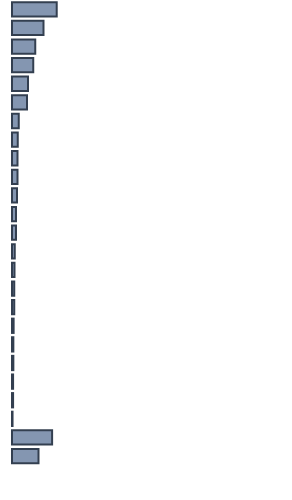
| Category | Series 0 |
|---|---|
| 0 | 16.5 |
| 1 | 11.6 |
| 2 | 8.6 |
| 3 | 7.8 |
| 4 | 5.9 |
| 5 | 5.5 |
| 6 | 2.5 |
| 7 | 2.1 |
| 8 | 2 |
| 9 | 2 |
| 10 | 1.8 |
| 11 | 1.5 |
| 12 | 1.5 |
| 13 | 1 |
| 14 | 0.9 |
| 15 | 0.8 |
| 16 | 0.8 |
| 17 | 0.6 |
| 18 | 0.5 |
| 19 | 0.5 |
| 20 | 0.4 |
| 21 | 0.4 |
| 22 | 0.2 |
| 23 | 14.8 |
| 24 | 9.8 |
| 25 | 0 |